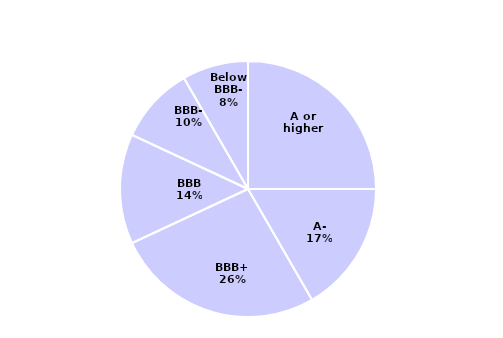
| Category | 72 EEI Index Companies at 12/31/03 |
|---|---|
| A or higher | 0.25 |
| A- | 0.167 |
| BBB+ | 0.264 |
| BBB | 0.139 |
| BBB- | 0.097 |
| Below BBB- | 0.083 |